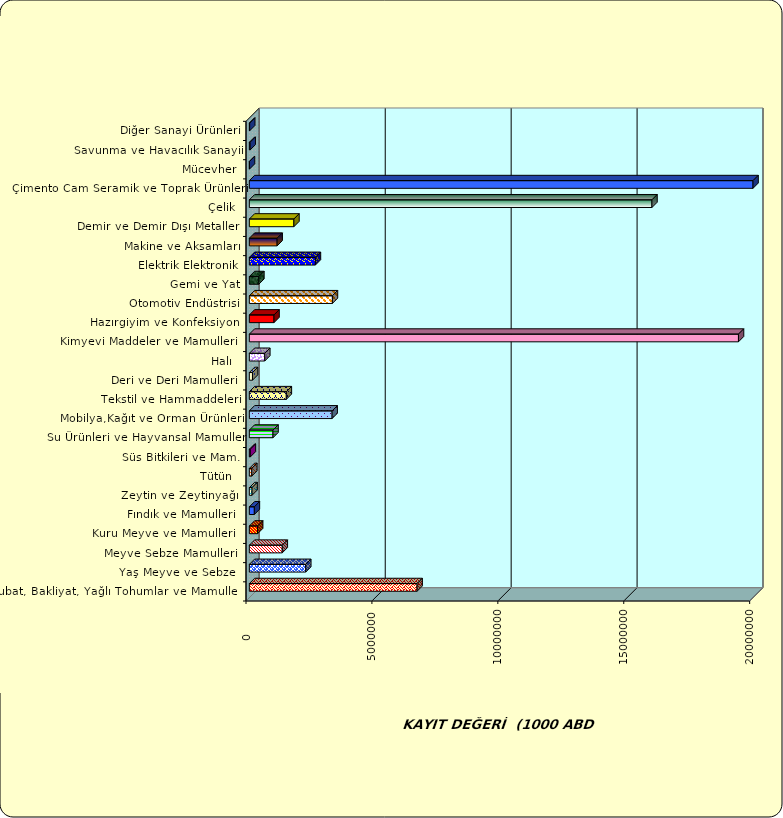
| Category | Series 0 |
|---|---|
|  Hububat, Bakliyat, Yağlı Tohumlar ve Mamulleri  | 6661308.582 |
|  Yaş Meyve ve Sebze   | 2239319.864 |
|  Meyve Sebze Mamulleri  | 1307318.777 |
|  Kuru Meyve ve Mamulleri   | 328009.363 |
|  Fındık ve Mamulleri  | 198413.866 |
|  Zeytin ve Zeytinyağı  | 106790.74 |
|  Tütün  | 95931.805 |
|  Süs Bitkileri ve Mam. | 39404.253 |
|  Su Ürünleri ve Hayvansal Mamuller | 939091.806 |
|  Mobilya,Kağıt ve Orman Ürünleri | 3286708.735 |
|  Tekstil ve Hammaddeleri | 1468102.129 |
|  Deri ve Deri Mamulleri  | 124797.56 |
|  Halı  | 612623.317 |
|  Kimyevi Maddeler ve Mamulleri   | 19422402.354 |
|  Hazırgiyim ve Konfeksiyon  | 979271.761 |
|  Otomotiv Endüstrisi | 3298304.511 |
|  Gemi ve Yat | 376091.604 |
|  Elektrik Elektronik | 2622382.033 |
|  Makine ve Aksamları | 1103222.574 |
|  Demir ve Demir Dışı Metaller  | 1769163.362 |
|  Çelik | 15986543.714 |
|  Çimento Cam Seramik ve Toprak Ürünleri | 24232931.323 |
|  Mücevher | 4368.803 |
|  Savunma ve Havacılık Sanayii | 31935.131 |
|  Diğer Sanayi Ürünleri | 13774.148 |